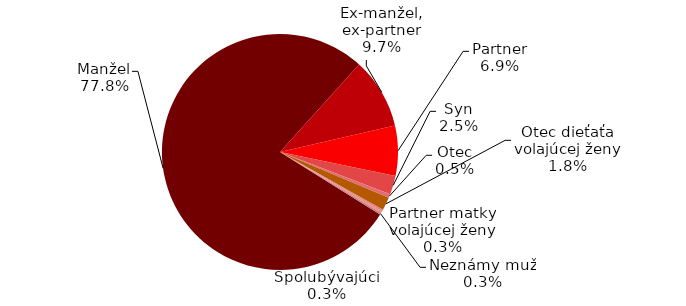
| Category | Series 0 |
|---|---|
| Manžel | 305 |
| Ex-manžel, ex-partner | 38 |
| Partner | 27 |
| Syn | 10 |
| Otec | 2 |
| Otec dieťaťa volajúcej ženy | 7 |
| Partner matky volajúcej ženy | 1 |
| Spolubývajúci | 1 |
| Neznámy muž | 1 |